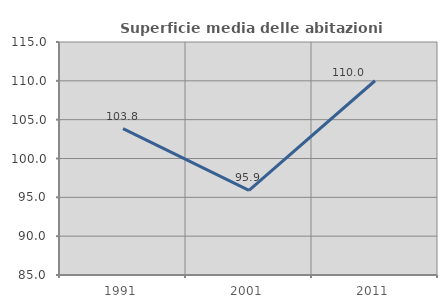
| Category | Superficie media delle abitazioni occupate |
|---|---|
| 1991.0 | 103.848 |
| 2001.0 | 95.898 |
| 2011.0 | 110.01 |